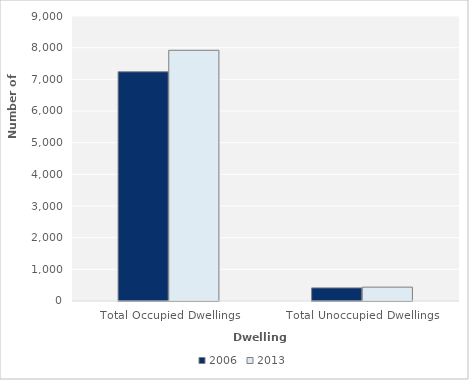
| Category | 2006 | 2013 |
|---|---|---|
| Total Occupied Dwellings | 7239 | 7917 |
| Total Unoccupied Dwellings | 414 | 438 |